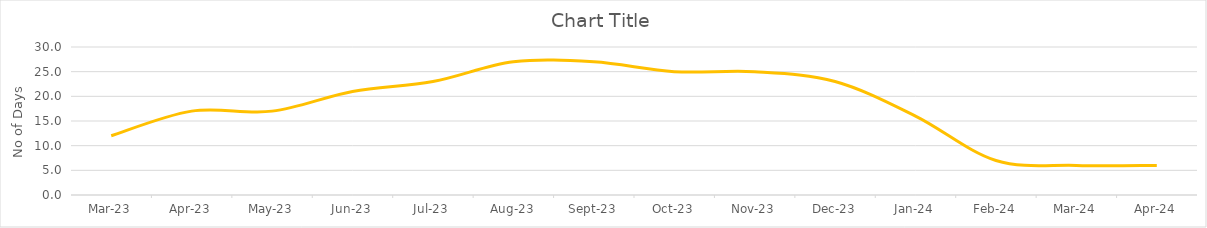
| Category | No of Appointments | No of Appointments made within 14 days | % of Appointments made within 14 days | Average No of Waiting Days for Appointment |
|---|---|---|---|---|
| 2023-03-01 |  |  |  | 12 |
| 2023-04-01 |  |  |  | 17 |
| 2023-05-01 |  |  |  | 17 |
| 2023-06-01 |  |  |  | 21 |
| 2023-07-01 |  |  |  | 23 |
| 2023-08-01 |  |  |  | 27 |
| 2023-09-01 |  |  |  | 27 |
| 2023-10-01 |  |  |  | 25 |
| 2023-11-01 |  |  |  | 25 |
| 2023-12-01 |  |  |  | 23 |
| 2024-01-01 |  |  |  | 16 |
| 2024-02-01 |  |  |  | 7 |
| 2024-03-01 |  |  |  | 6 |
| 2024-04-01 |  |  |  | 6 |